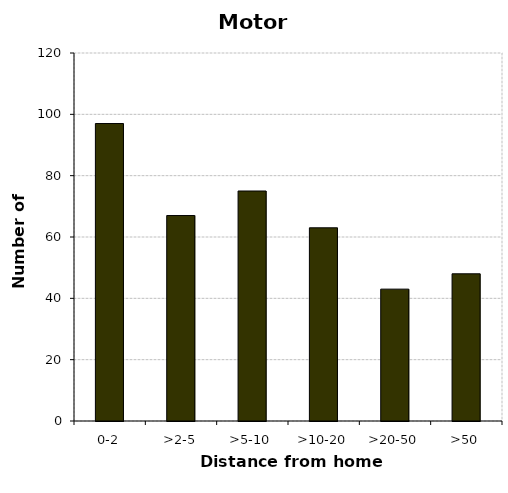
| Category | Motorcycles |
|---|---|
| 0-2 | 97 |
| >2-5 | 67 |
| >5-10 | 75 |
| >10-20 | 63 |
| >20-50 | 43 |
| >50 | 48 |